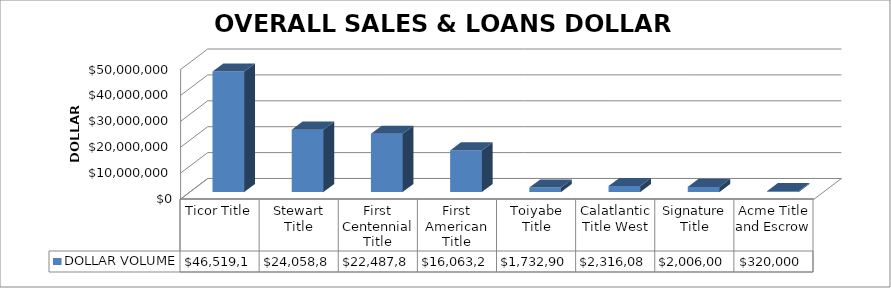
| Category | DOLLAR VOLUME |
|---|---|
| Ticor Title | 46519113 |
| Stewart Title | 24058861 |
| First Centennial Title | 22487837.7 |
| First American Title | 16063215 |
| Toiyabe Title | 1732900 |
| Calatlantic Title West | 2316082 |
| Signature Title | 2006000 |
| Acme Title and Escrow | 320000 |